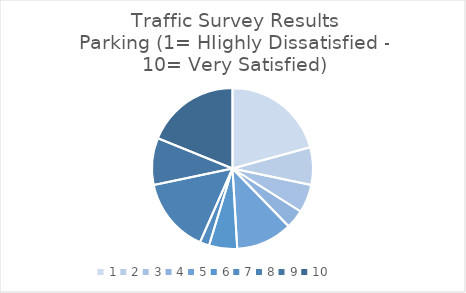
| Category | Series 0 |
|---|---|
| 1 | 11 |
| 2 | 4 |
| 3 | 3 |
| 4 | 2 |
| 5 | 6 |
| 6 | 3 |
| 7 | 1 |
| 8 | 8 |
| 9 | 5 |
| 10 | 10 |